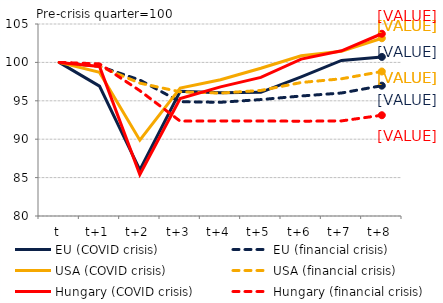
| Category | EU (COVID crisis) | EU (financial crisis) | USA (COVID crisis) | USA (financial crisis) | Hungary (COVID crisis) | Hungary (financial crisis) |
|---|---|---|---|---|---|---|
| t | 100 | 100 | 100 | 100 | 100 | 100 |
| t+1 | 96.909 | 99.494 | 98.696 | 99.473 | 99.479 | 99.806 |
| t+2 | 85.989 | 97.704 | 89.875 | 97.301 | 85.402 | 96.317 |
| t+3 | 96.231 | 94.874 | 96.659 | 96.167 | 95.283 | 92.354 |
| t+4 | 96.035 | 94.809 | 97.737 | 96.004 | 96.809 | 92.382 |
| t+5 | 96.098 | 95.16 | 99.236 | 96.351 | 98.049 | 92.371 |
| t+6 | 98.125 | 95.625 | 100.864 | 97.381 | 100.434 | 92.344 |
| t+7 | 100.262 | 96.014 | 101.441 | 97.868 | 101.508 | 92.385 |
| t+8 | 100.716 | 96.97 | 103.145 | 98.814 | 103.73 | 93.121 |